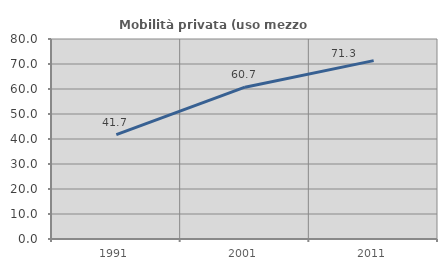
| Category | Mobilità privata (uso mezzo privato) |
|---|---|
| 1991.0 | 41.715 |
| 2001.0 | 60.734 |
| 2011.0 | 71.338 |